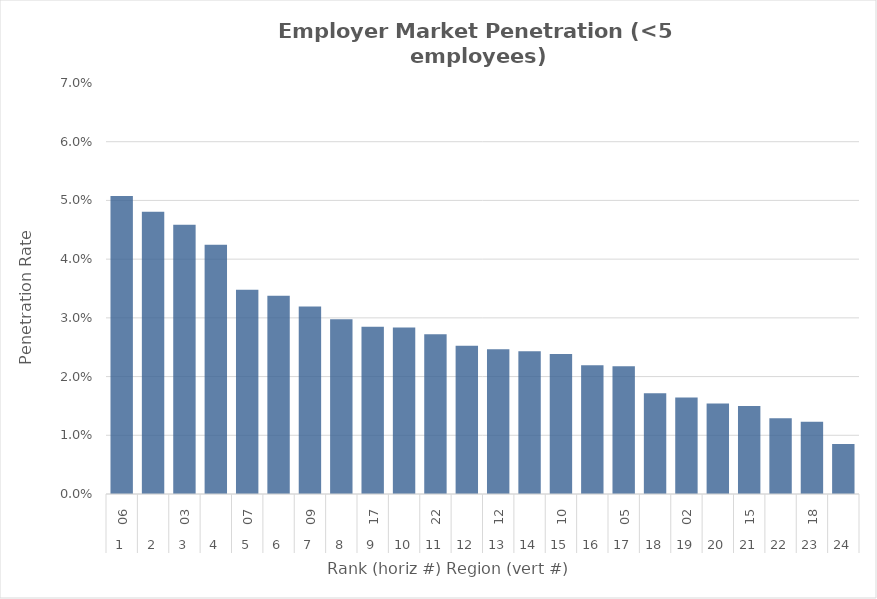
| Category | Rate |
|---|---|
| 0 | 0.051 |
| 1 | 0.048 |
| 2 | 0.046 |
| 3 | 0.042 |
| 4 | 0.035 |
| 5 | 0.034 |
| 6 | 0.032 |
| 7 | 0.03 |
| 8 | 0.028 |
| 9 | 0.028 |
| 10 | 0.027 |
| 11 | 0.025 |
| 12 | 0.025 |
| 13 | 0.024 |
| 14 | 0.024 |
| 15 | 0.022 |
| 16 | 0.022 |
| 17 | 0.017 |
| 18 | 0.016 |
| 19 | 0.015 |
| 20 | 0.015 |
| 21 | 0.013 |
| 22 | 0.012 |
| 23 | 0.009 |